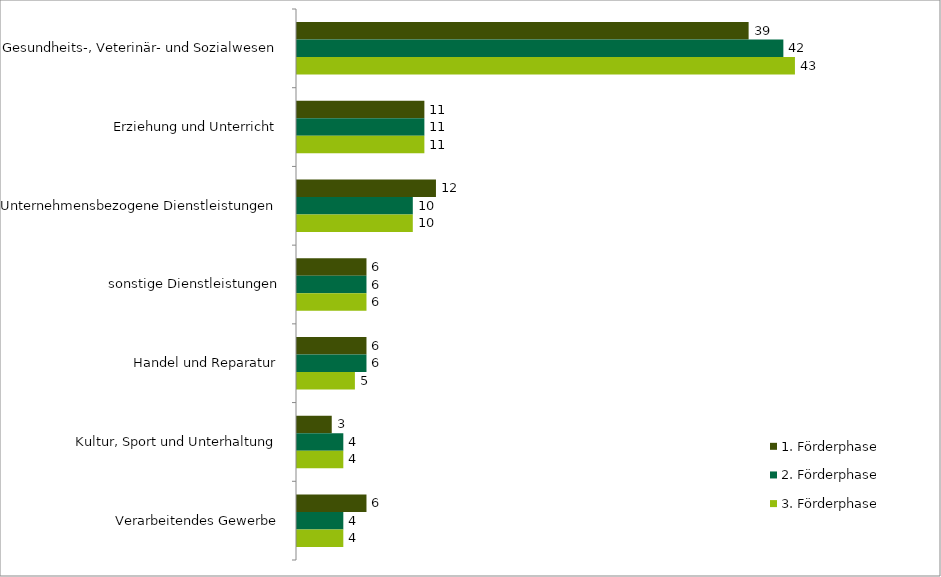
| Category | 1. Förderphase | 2. Förderphase | 3. Förderphase |
|---|---|---|---|
| Gesundheits-, Veterinär- und Sozialwesen | 39 | 42 | 43 |
| Erziehung und Unterricht | 11 | 11 | 11 |
| Unternehmensbezogene Dienstleistungen | 12 | 10 | 10 |
| sonstige Dienstleistungen | 6 | 6 | 6 |
| Handel und Reparatur | 6 | 6 | 5 |
| Kultur, Sport und Unterhaltung | 3 | 4 | 4 |
| Verarbeitendes Gewerbe | 6 | 4 | 4 |